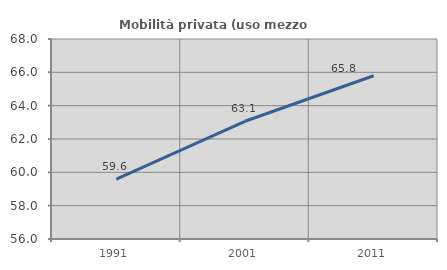
| Category | Mobilità privata (uso mezzo privato) |
|---|---|
| 1991.0 | 59.596 |
| 2001.0 | 63.063 |
| 2011.0 | 65.795 |